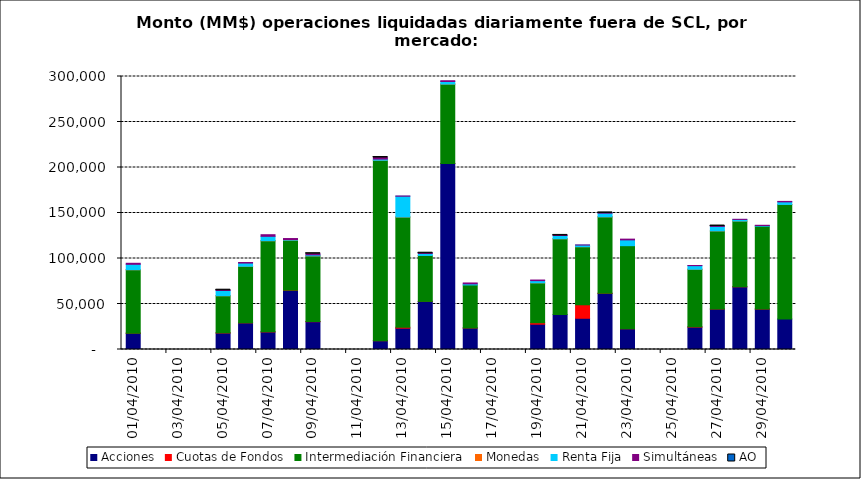
| Category | Acciones | Cuotas de Fondos | Intermediación Financiera | Monedas | Renta Fija | Simultáneas | AO |
|---|---|---|---|---|---|---|---|
| 01/04/2010 | 17931.351 | 34.937 | 69674.97 | 17.365 | 5961.352 | 1123.387 | 0 |
| 05/04/2010 | 18129.36 | 189.503 | 40750.298 | 26.18 | 5738.156 | 326.18 | 0.039 |
| 06/04/2010 | 29268.501 | 55.878 | 62080.535 | 41.18 | 3538.101 | 638.377 | 0 |
| 07/04/2010 | 19308.4 | 72.127 | 100118.267 | 41.561 | 4830.88 | 1780.999 | 0 |
| 08/04/2010 | 64953.29 | 251.024 | 54933.521 | 2.16 | 698.501 | 1097.564 | 0 |
| 09/04/2010 | 30535.037 | 171.177 | 72152.531 | 11.679 | 1146.926 | 1239.324 | 0.155 |
| 12/04/2010 | 9668.828 | 24.997 | 198209.866 | 27.119 | 1310.015 | 1709.631 | 0.012 |
| 13/04/2010 | 23421.643 | 1028.305 | 121114.509 | 52.155 | 22835.311 | 232.718 | 0 |
| 14/04/2010 | 52812.302 | 41.405 | 50481.275 | 6.68 | 2220.817 | 236.854 | 0.031 |
| 15/04/2010 | 204418.379 | 42.988 | 87189.869 | 3.512 | 2826.495 | 882.177 | 0 |
| 16/04/2010 | 23641.427 | 28.746 | 47258.959 | 0 | 1213.396 | 972.878 | 0 |
| 19/04/2010 | 27798.751 | 1607.651 | 43846.023 | 0.72 | 2396.442 | 684.249 | 0 |
| 20/04/2010 | 38369.512 | 0 | 83320.111 | 10.797 | 3567.76 | 86.929 | 0.044 |
| 21/04/2010 | 34317.744 | 14821.095 | 63788.674 | 7.39 | 1861.459 | 91.915 | 0 |
| 22/04/2010 | 61701.791 | 70.99 | 84006.14 | 1.065 | 4045.498 | 252.404 | 0.489 |
| 23/04/2010 | 22780.948 | 100.716 | 91205.475 | 0 | 6356.77 | 841.165 | 0 |
| 26/04/2010 | 24602.151 | 346.614 | 63240.984 | 4.555 | 3938.139 | 192.651 | 0 |
| 27/04/2010 | 44513.87 | 19.506 | 85806.732 | 13.65 | 4938.97 | 357.155 | 0.02 |
| 28/04/2010 | 68889.064 | 99.346 | 72176.409 | 3.897 | 1747.428 | 148.766 | 0 |
| 29/04/2010 | 44445.818 | 82.375 | 90969.008 | 0 | 656.208 | 350.338 | 0 |
| 30/04/2010 | 33443.073 | 0 | 125972.412 | 0.7 | 2826.808 | 495.658 | 0 |